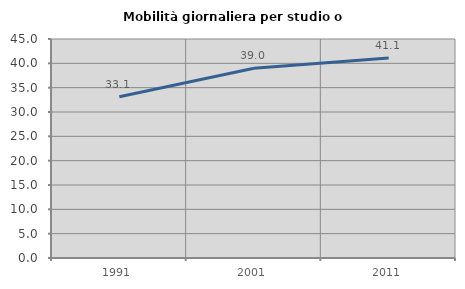
| Category | Mobilità giornaliera per studio o lavoro |
|---|---|
| 1991.0 | 33.144 |
| 2001.0 | 38.978 |
| 2011.0 | 41.114 |